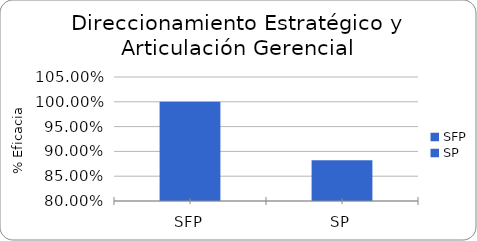
| Category | % Eficacia total |
|---|---|
| SFP | 1 |
| SP | 0.882 |